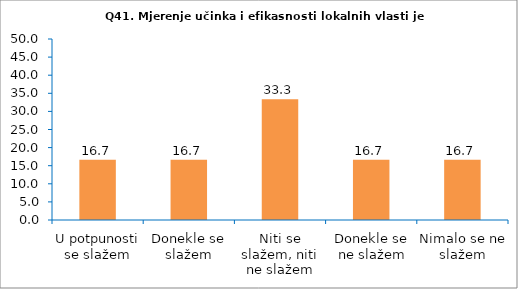
| Category | Series 0 |
|---|---|
| U potpunosti se slažem | 16.667 |
| Donekle se slažem | 16.667 |
| Niti se slažem, niti ne slažem | 33.333 |
| Donekle se ne slažem | 16.667 |
| Nimalo se ne slažem | 16.667 |